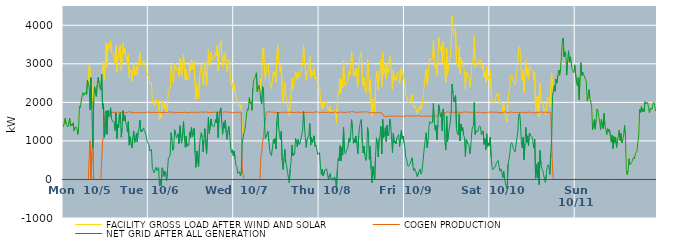
| Category | FACILITY GROSS LOAD AFTER WIND AND SOLAR | COGEN PRODUCTION | NET GRID AFTER ALL GENERATION |
|---|---|---|---|
|  Mon  10/5 | 1365 | 0 | 1365 |
|  Mon  10/5 | 1490 | 0 | 1490 |
|  Mon  10/5 | 1590 | 0 | 1590 |
|  Mon  10/5 | 1428 | 0 | 1428 |
|  Mon  10/5 | 1433 | 0 | 1433 |
|  Mon  10/5 | 1364 | 0 | 1364 |
|  Mon  10/5 | 1379 | 0 | 1379 |
|  Mon  10/5 | 1583 | 0 | 1583 |
|  Mon  10/5 | 1383 | 0 | 1383 |
|  Mon  10/5 | 1437 | 0 | 1437 |
|  Mon  10/5 | 1399 | 0 | 1399 |
|  Mon  10/5 | 1469 | 0 | 1469 |
|  Mon  10/5 | 1269 | 0 | 1269 |
|  Mon  10/5 | 1340 | 0 | 1340 |
|  Mon  10/5 | 1348 | 0 | 1348 |
|  Mon  10/5 | 1351 | 0 | 1351 |
|  Mon  10/5 | 1168 | 0 | 1168 |
|  Mon  10/5 | 1310 | 0 | 1310 |
|  Mon  10/5 | 1898 | 0 | 1898 |
|  Mon  10/5 | 1865 | 0 | 1865 |
|  Mon  10/5 | 2033 | 0 | 2033 |
|  Mon  10/5 | 2163 | 0 | 2163 |
|  Mon  10/5 | 2255 | 0 | 2255 |
|  Mon  10/5 | 2182 | 0 | 2182 |
|  Mon  10/5 | 2204 | 0 | 2204 |
|  Mon  10/5 | 2263 | 0 | 2263 |
|  Mon  10/5 | 2192 | 0 | 2192 |
|  Mon  10/5 | 2575 | 0 | 2575 |
|  Mon  10/5 | 2451 | 0 | 2451 |
|  Mon  10/5 | 2981 | 578 | 2403 |
|  Mon  10/5 | 2805 | 1005 | 1800 |
|  Mon  10/5 | 2639 | 0 | 2639 |
|  Mon  10/5 | 2528 | 690 | 1838 |
|  Mon  10/5 | 1899 | 1086 | 813 |
|  Mon  10/5 | 2031 | 0 | 2031 |
|  Mon  10/5 | 2404 | 0 | 2404 |
|  Mon  10/5 | 2396 | 0 | 2396 |
|  Mon  10/5 | 2156 | 0 | 2156 |
|  Mon  10/5 | 2456 | 0 | 2456 |
|  Mon  10/5 | 2650 | 0 | 2650 |
|  Mon  10/5 | 2511 | 0 | 2511 |
|  Mon  10/5 | 2378 | 0 | 2378 |
|  Mon  10/5 | 2320 | 0 | 2320 |
|  Mon  10/5 | 2735 | 0 | 2735 |
|  Mon  10/5 | 2832 | 989 | 1843 |
|  Mon  10/5 | 3069 | 1104 | 1965 |
|  Mon  10/5 | 2579 | 1488 | 1091 |
|  Mon  10/5 | 3002 | 1735 | 1267 |
|  Mon  10/5 | 3536 | 1754 | 1782 |
|  Mon  10/5 | 2909 | 1738 | 1171 |
|  Mon  10/5 | 3522 | 1730 | 1792 |
|  Mon  10/5 | 3376 | 1752 | 1624 |
|  Mon  10/5 | 3405 | 1743 | 1662 |
|  Mon  10/5 | 3607 | 1745 | 1862 |
|  Mon  10/5 | 3320 | 1741 | 1579 |
|  Mon  10/5 | 3256 | 1740 | 1516 |
|  Mon  10/5 | 3280 | 1743 | 1537 |
|  Mon  10/5 | 3243 | 1739 | 1504 |
|  Mon  10/5 | 3003 | 1735 | 1268 |
|  Mon  10/5 | 3469 | 1742 | 1727 |
|  Mon  10/5 | 2791 | 1731 | 1060 |
|  Mon  10/5 | 3174 | 1746 | 1428 |
|  Mon  10/5 | 3101 | 1752 | 1349 |
|  Mon  10/5 | 3425 | 1736 | 1689 |
|  Mon  10/5 | 3476 | 1745 | 1731 |
|  Mon  10/5 | 2830 | 1737 | 1093 |
|  Mon  10/5 | 3098 | 1751 | 1347 |
|  Mon  10/5 | 3538 | 1750 | 1788 |
|  Mon  10/5 | 3263 | 1740 | 1523 |
|  Mon  10/5 | 3399 | 1735 | 1664 |
|  Mon  10/5 | 3226 | 1742 | 1484 |
|  Mon  10/5 | 3146 | 1726 | 1420 |
|  Mon  10/5 | 2961 | 1735 | 1226 |
|  Mon  10/5 | 3250 | 1750 | 1500 |
|  Mon  10/5 | 2640 | 1750 | 890 |
|  Mon  10/5 | 2866 | 1757 | 1109 |
|  Mon  10/5 | 2833 | 1735 | 1098 |
|  Mon  10/5 | 2546 | 1730 | 816 |
|  Mon  10/5 | 2825 | 1749 | 1076 |
|  Mon  10/5 | 2998 | 1740 | 1258 |
|  Mon  10/5 | 2693 | 1741 | 952 |
|  Mon  10/5 | 2781 | 1731 | 1050 |
|  Mon  10/5 | 2938 | 1748 | 1190 |
|  Mon  10/5 | 2710 | 1736 | 974 |
|  Mon  10/5 | 2979 | 1745 | 1234 |
|  Mon  10/5 | 3075 | 1746 | 1329 |
|  Mon  10/5 | 3293 | 1754 | 1539 |
|  Mon  10/5 | 2963 | 1731 | 1232 |
|  Mon  10/5 | 3038 | 1750 | 1288 |
|  Mon  10/5 | 2984 | 1732 | 1252 |
|  Mon  10/5 | 3079 | 1740 | 1339 |
|  Mon  10/5 | 3006 | 1729 | 1277 |
|  Mon  10/5 | 2991 | 1734 | 1257 |
|  Mon  10/5 | 2894 | 1743 | 1151 |
|  Mon  10/5 | 2731 | 1741 | 990 |
|  Mon  10/5 | 2721 | 1749 | 972 |
|  Tue  10/6 | 2655 | 1754 | 901 |
|  Tue  10/6 | 2488 | 1742 | 746 |
|  Tue  10/6 | 2504 | 1743 | 761 |
|  Tue  10/6 | 2512 | 1735 | 777 |
|  Tue  10/6 | 2019 | 1742 | 277 |
|  Tue  10/6 | 1971 | 1740 | 231 |
|  Tue  10/6 | 1913 | 1742 | 171 |
|  Tue  10/6 | 1982 | 1740 | 242 |
|  Tue  10/6 | 2077 | 1758 | 319 |
|  Tue  10/6 | 1963 | 1732 | 231 |
|  Tue  10/6 | 1964 | 1732 | 232 |
|  Tue  10/6 | 2055 | 1747 | 308 |
|  Tue  10/6 | 1560 | 1729 | -169 |
|  Tue  10/6 | 1742 | 1741 | 1 |
|  Tue  10/6 | 1582 | 1745 | -163 |
|  Tue  10/6 | 2040 | 1737 | 303 |
|  Tue  10/6 | 1988 | 1736 | 252 |
|  Tue  10/6 | 1823 | 1746 | 77 |
|  Tue  10/6 | 1963 | 1751 | 212 |
|  Tue  10/6 | 1874 | 1736 | 138 |
|  Tue  10/6 | 1707 | 1742 | -35 |
|  Tue  10/6 | 1957 | 1739 | 218 |
|  Tue  10/6 | 2289 | 1737 | 552 |
|  Tue  10/6 | 2326 | 1754 | 572 |
|  Tue  10/6 | 2352 | 1734 | 618 |
|  Tue  10/6 | 2954 | 1741 | 1213 |
|  Tue  10/6 | 2784 | 1746 | 1038 |
|  Tue  10/6 | 2504 | 1749 | 755 |
|  Tue  10/6 | 2585 | 1753 | 832 |
|  Tue  10/6 | 3021 | 1732 | 1289 |
|  Tue  10/6 | 2957 | 1754 | 1203 |
|  Tue  10/6 | 2813 | 1737 | 1076 |
|  Tue  10/6 | 2829 | 1757 | 1072 |
|  Tue  10/6 | 2922 | 1736 | 1186 |
|  Tue  10/6 | 2667 | 1737 | 930 |
|  Tue  10/6 | 3136 | 1743 | 1393 |
|  Tue  10/6 | 2836 | 1740 | 1096 |
|  Tue  10/6 | 2675 | 1733 | 942 |
|  Tue  10/6 | 2980 | 1719 | 1261 |
|  Tue  10/6 | 3243 | 1743 | 1500 |
|  Tue  10/6 | 2838 | 1737 | 1101 |
|  Tue  10/6 | 2578 | 1745 | 833 |
|  Tue  10/6 | 2862 | 1739 | 1123 |
|  Tue  10/6 | 2590 | 1732 | 858 |
|  Tue  10/6 | 2653 | 1741 | 912 |
|  Tue  10/6 | 2621 | 1736 | 885 |
|  Tue  10/6 | 2978 | 1750 | 1228 |
|  Tue  10/6 | 2831 | 1744 | 1087 |
|  Tue  10/6 | 3105 | 1745 | 1360 |
|  Tue  10/6 | 2840 | 1737 | 1103 |
|  Tue  10/6 | 2864 | 1750 | 1114 |
|  Tue  10/6 | 3063 | 1741 | 1322 |
|  Tue  10/6 | 2434 | 1745 | 689 |
|  Tue  10/6 | 2065 | 1750 | 315 |
|  Tue  10/6 | 2466 | 1734 | 732 |
|  Tue  10/6 | 2474 | 1734 | 740 |
|  Tue  10/6 | 2085 | 1747 | 338 |
|  Tue  10/6 | 2620 | 1749 | 871 |
|  Tue  10/6 | 2823 | 1741 | 1082 |
|  Tue  10/6 | 2964 | 1752 | 1212 |
|  Tue  10/6 | 2846 | 1744 | 1102 |
|  Tue  10/6 | 2459 | 1742 | 717 |
|  Tue  10/6 | 2778 | 1754 | 1024 |
|  Tue  10/6 | 3060 | 1741 | 1319 |
|  Tue  10/6 | 3059 | 1735 | 1324 |
|  Tue  10/6 | 2426 | 1764 | 662 |
|  Tue  10/6 | 2886 | 1730 | 1156 |
|  Tue  10/6 | 3366 | 1754 | 1612 |
|  Tue  10/6 | 2938 | 1745 | 1193 |
|  Tue  10/6 | 2978 | 1766 | 1212 |
|  Tue  10/6 | 3304 | 1734 | 1570 |
|  Tue  10/6 | 3131 | 1733 | 1398 |
|  Tue  10/6 | 3143 | 1742 | 1401 |
|  Tue  10/6 | 3108 | 1747 | 1361 |
|  Tue  10/6 | 3166 | 1746 | 1420 |
|  Tue  10/6 | 3295 | 1742 | 1553 |
|  Tue  10/6 | 3209 | 1743 | 1466 |
|  Tue  10/6 | 3489 | 1733 | 1756 |
|  Tue  10/6 | 2827 | 1739 | 1088 |
|  Tue  10/6 | 3343 | 1726 | 1617 |
|  Tue  10/6 | 3537 | 1745 | 1792 |
|  Tue  10/6 | 3594 | 1736 | 1858 |
|  Tue  10/6 | 3250 | 1759 | 1491 |
|  Tue  10/6 | 2926 | 1752 | 1174 |
|  Tue  10/6 | 3213 | 1738 | 1475 |
|  Tue  10/6 | 3072 | 1741 | 1331 |
|  Tue  10/6 | 3288 | 1757 | 1531 |
|  Tue  10/6 | 2965 | 1750 | 1215 |
|  Tue  10/6 | 2787 | 1747 | 1040 |
|  Tue  10/6 | 3020 | 1759 | 1261 |
|  Tue  10/6 | 3115 | 1736 | 1379 |
|  Tue  10/6 | 2903 | 1749 | 1154 |
|  Tue  10/6 | 2573 | 1749 | 824 |
|  Tue  10/6 | 2430 | 1729 | 701 |
|  Tue  10/6 | 2497 | 1729 | 768 |
|  Tue  10/6 | 2345 | 1731 | 614 |
|  Wed  10/7 | 2477 | 1740 | 737 |
|  Wed  10/7 | 2272 | 1732 | 540 |
|  Wed  10/7 | 2114 | 1742 | 372 |
|  Wed  10/7 | 2078 | 1746 | 332 |
|  Wed  10/7 | 1900 | 1741 | 159 |
|  Wed  10/7 | 1901 | 1741 | 160 |
|  Wed  10/7 | 1946 | 1741 | 205 |
|  Wed  10/7 | 1840 | 1746 | 94 |
|  Wed  10/7 | 1944 | 1752 | 192 |
|  Wed  10/7 | 1191 | 267 | 924 |
|  Wed  10/7 | 1191 | 267 | 924 |
|  Wed  10/7 | 1211 | 0 | 1211 |
|  Wed  10/7 | 1268 | 0 | 1268 |
|  Wed  10/7 | 1478 | 0 | 1478 |
|  Wed  10/7 | 1711 | 0 | 1711 |
|  Wed  10/7 | 1841 | 0 | 1841 |
|  Wed  10/7 | 1808 | 0 | 1808 |
|  Wed  10/7 | 2123 | 0 | 2123 |
|  Wed  10/7 | 1969 | 0 | 1969 |
|  Wed  10/7 | 2005 | 0 | 2005 |
|  Wed  10/7 | 1792 | 0 | 1792 |
|  Wed  10/7 | 2372 | 0 | 2372 |
|  Wed  10/7 | 2576 | 0 | 2576 |
|  Wed  10/7 | 2617 | 0 | 2617 |
|  Wed  10/7 | 2629 | 0 | 2629 |
|  Wed  10/7 | 2767 | 0 | 2767 |
|  Wed  10/7 | 2274 | 0 | 2274 |
|  Wed  10/7 | 2396 | 0 | 2396 |
|  Wed  10/7 | 2443 | 0 | 2443 |
|  Wed  10/7 | 2291 | 0 | 2291 |
|  Wed  10/7 | 2620 | 590 | 2030 |
|  Wed  10/7 | 2659 | 693 | 1966 |
|  Wed  10/7 | 3381 | 976 | 2405 |
|  Wed  10/7 | 3428 | 1113 | 2315 |
|  Wed  10/7 | 2904 | 1394 | 1510 |
|  Wed  10/7 | 2568 | 1501 | 1067 |
|  Wed  10/7 | 2866 | 1741 | 1125 |
|  Wed  10/7 | 2874 | 1736 | 1138 |
|  Wed  10/7 | 2998 | 1755 | 1243 |
|  Wed  10/7 | 2742 | 1754 | 988 |
|  Wed  10/7 | 2513 | 1753 | 760 |
|  Wed  10/7 | 2404 | 1748 | 656 |
|  Wed  10/7 | 2362 | 1746 | 616 |
|  Wed  10/7 | 2341 | 1744 | 597 |
|  Wed  10/7 | 2781 | 1748 | 1033 |
|  Wed  10/7 | 2695 | 1761 | 934 |
|  Wed  10/7 | 2796 | 1728 | 1068 |
|  Wed  10/7 | 2535 | 1745 | 790 |
|  Wed  10/7 | 3232 | 1740 | 1492 |
|  Wed  10/7 | 3486 | 1739 | 1747 |
|  Wed  10/7 | 3087 | 1734 | 1353 |
|  Wed  10/7 | 2910 | 1745 | 1165 |
|  Wed  10/7 | 2770 | 1739 | 1031 |
|  Wed  10/7 | 2994 | 1743 | 1251 |
|  Wed  10/7 | 2241 | 1744 | 497 |
|  Wed  10/7 | 1998 | 1737 | 261 |
|  Wed  10/7 | 2286 | 1742 | 544 |
|  Wed  10/7 | 2521 | 1738 | 783 |
|  Wed  10/7 | 2186 | 1745 | 441 |
|  Wed  10/7 | 2096 | 1742 | 354 |
|  Wed  10/7 | 1922 | 1738 | 184 |
|  Wed  10/7 | 1924 | 1740 | 184 |
|  Wed  10/7 | 1658 | 1745 | -87 |
|  Wed  10/7 | 2008 | 1742 | 266 |
|  Wed  10/7 | 2216 | 1744 | 472 |
|  Wed  10/7 | 2636 | 1741 | 895 |
|  Wed  10/7 | 2347 | 1736 | 611 |
|  Wed  10/7 | 2414 | 1734 | 680 |
|  Wed  10/7 | 2391 | 1737 | 654 |
|  Wed  10/7 | 2804 | 1742 | 1062 |
|  Wed  10/7 | 2707 | 1741 | 966 |
|  Wed  10/7 | 2589 | 1746 | 843 |
|  Wed  10/7 | 2784 | 1747 | 1037 |
|  Wed  10/7 | 2639 | 1730 | 909 |
|  Wed  10/7 | 2671 | 1735 | 936 |
|  Wed  10/7 | 2781 | 1722 | 1059 |
|  Wed  10/7 | 2895 | 1741 | 1154 |
|  Wed  10/7 | 3011 | 1735 | 1276 |
|  Wed  10/7 | 3497 | 1733 | 1764 |
|  Wed  10/7 | 3125 | 1743 | 1382 |
|  Wed  10/7 | 2828 | 1745 | 1083 |
|  Wed  10/7 | 2577 | 1746 | 831 |
|  Wed  10/7 | 2778 | 1734 | 1044 |
|  Wed  10/7 | 2782 | 1748 | 1034 |
|  Wed  10/7 | 2876 | 1739 | 1137 |
|  Wed  10/7 | 3204 | 1750 | 1454 |
|  Wed  10/7 | 2633 | 1742 | 891 |
|  Wed  10/7 | 2838 | 1745 | 1093 |
|  Wed  10/7 | 2688 | 1731 | 957 |
|  Wed  10/7 | 2718 | 1736 | 982 |
|  Wed  10/7 | 2875 | 1744 | 1131 |
|  Wed  10/7 | 2609 | 1755 | 854 |
|  Wed  10/7 | 2641 | 1755 | 886 |
|  Wed  10/7 | 2604 | 1743 | 861 |
|  Thu  10/8 | 2401 | 1752 | 649 |
|  Thu  10/8 | 2386 | 1746 | 640 |
|  Thu  10/8 | 2426 | 1728 | 698 |
|  Thu  10/8 | 2118 | 1752 | 366 |
|  Thu  10/8 | 1875 | 1742 | 133 |
|  Thu  10/8 | 2011 | 1747 | 264 |
|  Thu  10/8 | 1832 | 1740 | 92 |
|  Thu  10/8 | 1827 | 1729 | 98 |
|  Thu  10/8 | 1989 | 1743 | 246 |
|  Thu  10/8 | 1997 | 1730 | 267 |
|  Thu  10/8 | 2010 | 1736 | 274 |
|  Thu  10/8 | 2009 | 1745 | 264 |
|  Thu  10/8 | 1746 | 1751 | -5 |
|  Thu  10/8 | 1845 | 1743 | 102 |
|  Thu  10/8 | 1887 | 1730 | 157 |
|  Thu  10/8 | 1740 | 1734 | 6 |
|  Thu  10/8 | 1745 | 1740 | 5 |
|  Thu  10/8 | 1768 | 1735 | 33 |
|  Thu  10/8 | 1718 | 1740 | -22 |
|  Thu  10/8 | 1798 | 1730 | 68 |
|  Thu  10/8 | 1743 | 1754 | -11 |
|  Thu  10/8 | 1461 | 1752 | -291 |
|  Thu  10/8 | 1969 | 1725 | 244 |
|  Thu  10/8 | 2279 | 1730 | 549 |
|  Thu  10/8 | 2227 | 1743 | 484 |
|  Thu  10/8 | 2622 | 1746 | 876 |
|  Thu  10/8 | 2231 | 1751 | 480 |
|  Thu  10/8 | 2588 | 1750 | 838 |
|  Thu  10/8 | 2373 | 1743 | 630 |
|  Thu  10/8 | 3097 | 1749 | 1348 |
|  Thu  10/8 | 2472 | 1737 | 735 |
|  Thu  10/8 | 2419 | 1751 | 668 |
|  Thu  10/8 | 2479 | 1744 | 735 |
|  Thu  10/8 | 2487 | 1751 | 736 |
|  Thu  10/8 | 2574 | 1750 | 824 |
|  Thu  10/8 | 2806 | 1741 | 1065 |
|  Thu  10/8 | 2714 | 1745 | 969 |
|  Thu  10/8 | 2907 | 1748 | 1159 |
|  Thu  10/8 | 3316 | 1765 | 1551 |
|  Thu  10/8 | 3066 | 1749 | 1317 |
|  Thu  10/8 | 2695 | 1756 | 939 |
|  Thu  10/8 | 2802 | 1738 | 1064 |
|  Thu  10/8 | 2693 | 1743 | 950 |
|  Thu  10/8 | 2883 | 1754 | 1129 |
|  Thu  10/8 | 2678 | 1744 | 934 |
|  Thu  10/8 | 2396 | 1730 | 666 |
|  Thu  10/8 | 2879 | 1746 | 1133 |
|  Thu  10/8 | 3104 | 1744 | 1360 |
|  Thu  10/8 | 3239 | 1743 | 1496 |
|  Thu  10/8 | 3301 | 1746 | 1555 |
|  Thu  10/8 | 2716 | 1751 | 965 |
|  Thu  10/8 | 2425 | 1739 | 686 |
|  Thu  10/8 | 2624 | 1757 | 867 |
|  Thu  10/8 | 2387 | 1755 | 632 |
|  Thu  10/8 | 2239 | 1744 | 495 |
|  Thu  10/8 | 2373 | 1750 | 623 |
|  Thu  10/8 | 3119 | 1760 | 1359 |
|  Thu  10/8 | 2902 | 1748 | 1154 |
|  Thu  10/8 | 2258 | 1735 | 523 |
|  Thu  10/8 | 2612 | 1750 | 862 |
|  Thu  10/8 | 1999 | 1730 | 269 |
|  Thu  10/8 | 1647 | 1737 | -90 |
|  Thu  10/8 | 2074 | 1740 | 334 |
|  Thu  10/8 | 1879 | 1751 | 128 |
|  Thu  10/8 | 1716 | 1725 | -9 |
|  Thu  10/8 | 2359 | 1742 | 617 |
|  Thu  10/8 | 2815 | 1733 | 1082 |
|  Thu  10/8 | 2645 | 1735 | 910 |
|  Thu  10/8 | 2321 | 1739 | 582 |
|  Thu  10/8 | 2809 | 1754 | 1055 |
|  Thu  10/8 | 2842 | 1727 | 1115 |
|  Thu  10/8 | 3117 | 1741 | 1376 |
|  Thu  10/8 | 2399 | 1735 | 664 |
|  Thu  10/8 | 3300 | 1738 | 1562 |
|  Thu  10/8 | 2726 | 1644 | 1082 |
|  Thu  10/8 | 2832 | 1644 | 1188 |
|  Thu  10/8 | 2978 | 1635 | 1343 |
|  Thu  10/8 | 2612 | 1633 | 979 |
|  Thu  10/8 | 3041 | 1633 | 1408 |
|  Thu  10/8 | 2771 | 1642 | 1129 |
|  Thu  10/8 | 2828 | 1644 | 1184 |
|  Thu  10/8 | 3198 | 1636 | 1562 |
|  Thu  10/8 | 3065 | 1641 | 1424 |
|  Thu  10/8 | 3061 | 1631 | 1430 |
|  Thu  10/8 | 2341 | 1644 | 697 |
|  Thu  10/8 | 2843 | 1643 | 1200 |
|  Thu  10/8 | 2591 | 1642 | 949 |
|  Thu  10/8 | 2657 | 1657 | 1000 |
|  Thu  10/8 | 2560 | 1638 | 922 |
|  Thu  10/8 | 2727 | 1650 | 1077 |
|  Thu  10/8 | 2742 | 1642 | 1100 |
|  Thu  10/8 | 2814 | 1651 | 1163 |
|  Thu  10/8 | 2494 | 1638 | 856 |
|  Thu  10/8 | 2515 | 1638 | 877 |
|  Thu  10/8 | 2906 | 1640 | 1266 |
|  Thu  10/8 | 2685 | 1631 | 1054 |
|  Fri  10/9 | 2748 | 1626 | 1122 |
|  Fri  10/9 | 2601 | 1652 | 949 |
|  Fri  10/9 | 2471 | 1650 | 821 |
|  Fri  10/9 | 2207 | 1640 | 567 |
|  Fri  10/9 | 2165 | 1642 | 523 |
|  Fri  10/9 | 2015 | 1653 | 362 |
|  Fri  10/9 | 1979 | 1643 | 336 |
|  Fri  10/9 | 2016 | 1637 | 379 |
|  Fri  10/9 | 2058 | 1640 | 418 |
|  Fri  10/9 | 2078 | 1657 | 421 |
|  Fri  10/9 | 2200 | 1637 | 563 |
|  Fri  10/9 | 2000 | 1644 | 356 |
|  Fri  10/9 | 1869 | 1643 | 226 |
|  Fri  10/9 | 1931 | 1648 | 283 |
|  Fri  10/9 | 1868 | 1639 | 229 |
|  Fri  10/9 | 1887 | 1645 | 242 |
|  Fri  10/9 | 1704 | 1638 | 66 |
|  Fri  10/9 | 1812 | 1651 | 161 |
|  Fri  10/9 | 1809 | 1650 | 159 |
|  Fri  10/9 | 1926 | 1652 | 274 |
|  Fri  10/9 | 1804 | 1666 | 138 |
|  Fri  10/9 | 1804 | 1624 | 180 |
|  Fri  10/9 | 2025 | 1636 | 389 |
|  Fri  10/9 | 2285 | 1650 | 635 |
|  Fri  10/9 | 2290 | 1645 | 645 |
|  Fri  10/9 | 2707 | 1642 | 1065 |
|  Fri  10/9 | 2856 | 1645 | 1211 |
|  Fri  10/9 | 2469 | 1643 | 826 |
|  Fri  10/9 | 2624 | 1648 | 976 |
|  Fri  10/9 | 3020 | 1644 | 1376 |
|  Fri  10/9 | 3151 | 1650 | 1501 |
|  Fri  10/9 | 3107 | 1642 | 1465 |
|  Fri  10/9 | 3098 | 1642 | 1456 |
|  Fri  10/9 | 3121 | 1648 | 1473 |
|  Fri  10/9 | 3609 | 1635 | 1974 |
|  Fri  10/9 | 3142 | 1641 | 1501 |
|  Fri  10/9 | 2920 | 1641 | 1279 |
|  Fri  10/9 | 3034 | 1635 | 1399 |
|  Fri  10/9 | 2687 | 1658 | 1029 |
|  Fri  10/9 | 3069 | 1653 | 1416 |
|  Fri  10/9 | 3694 | 1755 | 1939 |
|  Fri  10/9 | 3528 | 1720 | 1808 |
|  Fri  10/9 | 3347 | 1727 | 1620 |
|  Fri  10/9 | 3451 | 1739 | 1712 |
|  Fri  10/9 | 3012 | 1752 | 1260 |
|  Fri  10/9 | 3570 | 1740 | 1830 |
|  Fri  10/9 | 3398 | 1752 | 1646 |
|  Fri  10/9 | 2711 | 1729 | 982 |
|  Fri  10/9 | 2515 | 1752 | 763 |
|  Fri  10/9 | 3395 | 1754 | 1641 |
|  Fri  10/9 | 2720 | 1736 | 984 |
|  Fri  10/9 | 2940 | 1746 | 1194 |
|  Fri  10/9 | 3076 | 1741 | 1335 |
|  Fri  10/9 | 3203 | 1734 | 1469 |
|  Fri  10/9 | 3497 | 1744 | 1753 |
|  Fri  10/9 | 4236 | 1760 | 2476 |
|  Fri  10/9 | 3991 | 1747 | 2244 |
|  Fri  10/9 | 3732 | 1729 | 2003 |
|  Fri  10/9 | 3769 | 1746 | 2023 |
|  Fri  10/9 | 3927 | 1741 | 2186 |
|  Fri  10/9 | 3071 | 1745 | 1326 |
|  Fri  10/9 | 2939 | 1745 | 1194 |
|  Fri  10/9 | 2897 | 1745 | 1152 |
|  Fri  10/9 | 3447 | 1743 | 1704 |
|  Fri  10/9 | 2734 | 1733 | 1001 |
|  Fri  10/9 | 3174 | 1734 | 1440 |
|  Fri  10/9 | 3023 | 1754 | 1269 |
|  Fri  10/9 | 3073 | 1728 | 1345 |
|  Fri  10/9 | 2899 | 1757 | 1142 |
|  Fri  10/9 | 2846 | 1749 | 1097 |
|  Fri  10/9 | 2338 | 1746 | 592 |
|  Fri  10/9 | 2781 | 1741 | 1040 |
|  Fri  10/9 | 2794 | 1746 | 1048 |
|  Fri  10/9 | 2672 | 1749 | 923 |
|  Fri  10/9 | 2639 | 1750 | 889 |
|  Fri  10/9 | 2409 | 1743 | 666 |
|  Fri  10/9 | 2579 | 1741 | 838 |
|  Fri  10/9 | 2925 | 1733 | 1192 |
|  Fri  10/9 | 3101 | 1736 | 1365 |
|  Fri  10/9 | 3154 | 1763 | 1391 |
|  Fri  10/9 | 3740 | 1745 | 1995 |
|  Fri  10/9 | 2915 | 1746 | 1169 |
|  Fri  10/9 | 2988 | 1736 | 1252 |
|  Fri  10/9 | 3010 | 1734 | 1276 |
|  Fri  10/9 | 2976 | 1735 | 1241 |
|  Fri  10/9 | 3095 | 1739 | 1356 |
|  Fri  10/9 | 3117 | 1726 | 1391 |
|  Fri  10/9 | 3106 | 1749 | 1357 |
|  Fri  10/9 | 2900 | 1740 | 1160 |
|  Fri  10/9 | 2873 | 1727 | 1146 |
|  Fri  10/9 | 2986 | 1725 | 1261 |
|  Fri  10/9 | 2648 | 1738 | 910 |
|  Fri  10/9 | 2799 | 1736 | 1063 |
|  Fri  10/9 | 2518 | 1739 | 779 |
|  Fri  10/9 | 2930 | 1744 | 1186 |
|  Fri  10/9 | 2579 | 1735 | 844 |
|  Sat  10/10 | 2685 | 1737 | 948 |
|  Sat  10/10 | 2630 | 1753 | 877 |
|  Sat  10/10 | 2848 | 1746 | 1102 |
|  Sat  10/10 | 2312 | 1740 | 572 |
|  Sat  10/10 | 2090 | 1753 | 337 |
|  Sat  10/10 | 2004 | 1752 | 252 |
|  Sat  10/10 | 2029 | 1750 | 279 |
|  Sat  10/10 | 2012 | 1737 | 275 |
|  Sat  10/10 | 2087 | 1738 | 349 |
|  Sat  10/10 | 2206 | 1755 | 451 |
|  Sat  10/10 | 2167 | 1728 | 439 |
|  Sat  10/10 | 2234 | 1742 | 492 |
|  Sat  10/10 | 2041 | 1736 | 305 |
|  Sat  10/10 | 1951 | 1735 | 216 |
|  Sat  10/10 | 2016 | 1739 | 277 |
|  Sat  10/10 | 1923 | 1746 | 177 |
|  Sat  10/10 | 1771 | 1731 | 40 |
|  Sat  10/10 | 1961 | 1743 | 218 |
|  Sat  10/10 | 1798 | 1755 | 43 |
|  Sat  10/10 | 1629 | 1736 | -107 |
|  Sat  10/10 | 1622 | 1740 | -118 |
|  Sat  10/10 | 1491 | 1746 | -255 |
|  Sat  10/10 | 2137 | 1734 | 403 |
|  Sat  10/10 | 2249 | 1747 | 502 |
|  Sat  10/10 | 2417 | 1738 | 679 |
|  Sat  10/10 | 2660 | 1753 | 907 |
|  Sat  10/10 | 2710 | 1753 | 957 |
|  Sat  10/10 | 2638 | 1741 | 897 |
|  Sat  10/10 | 2533 | 1736 | 797 |
|  Sat  10/10 | 2518 | 1746 | 772 |
|  Sat  10/10 | 2457 | 1741 | 716 |
|  Sat  10/10 | 2473 | 1741 | 732 |
|  Sat  10/10 | 2828 | 1737 | 1091 |
|  Sat  10/10 | 3018 | 1762 | 1256 |
|  Sat  10/10 | 3397 | 1736 | 1661 |
|  Sat  10/10 | 3443 | 1732 | 1711 |
|  Sat  10/10 | 3201 | 1733 | 1468 |
|  Sat  10/10 | 2673 | 1727 | 946 |
|  Sat  10/10 | 2568 | 1750 | 818 |
|  Sat  10/10 | 2848 | 1750 | 1098 |
|  Sat  10/10 | 2250 | 1735 | 515 |
|  Sat  10/10 | 2680 | 1746 | 934 |
|  Sat  10/10 | 3090 | 1739 | 1351 |
|  Sat  10/10 | 2688 | 1732 | 956 |
|  Sat  10/10 | 2872 | 1740 | 1132 |
|  Sat  10/10 | 2619 | 1744 | 875 |
|  Sat  10/10 | 2955 | 1750 | 1205 |
|  Sat  10/10 | 2894 | 1744 | 1150 |
|  Sat  10/10 | 2883 | 1733 | 1150 |
|  Sat  10/10 | 2855 | 1742 | 1113 |
|  Sat  10/10 | 2829 | 1737 | 1092 |
|  Sat  10/10 | 2553 | 1735 | 818 |
|  Sat  10/10 | 2769 | 1721 | 1048 |
|  Sat  10/10 | 1770 | 1739 | 31 |
|  Sat  10/10 | 2125 | 1736 | 389 |
|  Sat  10/10 | 1791 | 1746 | 45 |
|  Sat  10/10 | 2185 | 1737 | 448 |
|  Sat  10/10 | 1622 | 1753 | -131 |
|  Sat  10/10 | 2497 | 1746 | 751 |
|  Sat  10/10 | 2140 | 1755 | 385 |
|  Sat  10/10 | 2043 | 1753 | 290 |
|  Sat  10/10 | 1985 | 1752 | 233 |
|  Sat  10/10 | 1849 | 1730 | 119 |
|  Sat  10/10 | 1858 | 1749 | 109 |
|  Sat  10/10 | 1677 | 1753 | -76 |
|  Sat  10/10 | 1854 | 1746 | 108 |
|  Sat  10/10 | 2070 | 1732 | 338 |
|  Sat  10/10 | 2125 | 1747 | 378 |
|  Sat  10/10 | 2080 | 1747 | 333 |
|  Sat  10/10 | 1885 | 1753 | 132 |
|  Sat  10/10 | 2398 | 1741 | 657 |
|  Sat  10/10 | 2764 | 1756 | 1008 |
|  Sat  10/10 | 2423 | 262 | 2161 |
|  Sat  10/10 | 2285 | 0 | 2285 |
|  Sat  10/10 | 2440 | 0 | 2440 |
|  Sat  10/10 | 2287 | 0 | 2287 |
|  Sat  10/10 | 2601 | 0 | 2601 |
|  Sat  10/10 | 2498 | 0 | 2498 |
|  Sat  10/10 | 2708 | 0 | 2708 |
|  Sat  10/10 | 2838 | 0 | 2838 |
|  Sat  10/10 | 2702 | 0 | 2702 |
|  Sat  10/10 | 2879 | 0 | 2879 |
|  Sat  10/10 | 3194 | 0 | 3194 |
|  Sat  10/10 | 3585 | 0 | 3585 |
|  Sat  10/10 | 3669 | 0 | 3669 |
|  Sat  10/10 | 3177 | 0 | 3177 |
|  Sat  10/10 | 3313 | 0 | 3313 |
|  Sat  10/10 | 3212 | 0 | 3212 |
|  Sat  10/10 | 2708 | 0 | 2708 |
|  Sat  10/10 | 3093 | 0 | 3093 |
|  Sat  10/10 | 3342 | 0 | 3342 |
|  Sat  10/10 | 3038 | 0 | 3038 |
|  Sat  10/10 | 3182 | 0 | 3182 |
|  Sat  10/10 | 3035 | 0 | 3035 |
|  Sat  10/10 | 2856 | 0 | 2856 |
|  Sat  10/10 | 2880 | 0 | 2880 |
|  Sun  10/11 | 2768 | 0 | 2768 |
|  Sun  10/11 | 2972 | 0 | 2972 |
|  Sun  10/11 | 2997 | 0 | 2997 |
|  Sun  10/11 | 2521 | 0 | 2521 |
|  Sun  10/11 | 2430 | 0 | 2430 |
|  Sun  10/11 | 2639 | 0 | 2639 |
|  Sun  10/11 | 2075 | 0 | 2075 |
|  Sun  10/11 | 2658 | 0 | 2658 |
|  Sun  10/11 | 3030 | 0 | 3030 |
|  Sun  10/11 | 2689 | 0 | 2689 |
|  Sun  10/11 | 2787 | 0 | 2787 |
|  Sun  10/11 | 2725 | 0 | 2725 |
|  Sun  10/11 | 2748 | 0 | 2748 |
|  Sun  10/11 | 2603 | 0 | 2603 |
|  Sun  10/11 | 2529 | 0 | 2529 |
|  Sun  10/11 | 2033 | 0 | 2033 |
|  Sun  10/11 | 2147 | 0 | 2147 |
|  Sun  10/11 | 2331 | 0 | 2331 |
|  Sun  10/11 | 2099 | 0 | 2099 |
|  Sun  10/11 | 2005 | 0 | 2005 |
|  Sun  10/11 | 1914 | 0 | 1914 |
|  Sun  10/11 | 1290 | 0 | 1290 |
|  Sun  10/11 | 1439 | 0 | 1439 |
|  Sun  10/11 | 1557 | 0 | 1557 |
|  Sun  10/11 | 1303 | 0 | 1303 |
|  Sun  10/11 | 1545 | 0 | 1545 |
|  Sun  10/11 | 1830 | 0 | 1830 |
|  Sun  10/11 | 1781 | 0 | 1781 |
|  Sun  10/11 | 1634 | 0 | 1634 |
|  Sun  10/11 | 1511 | 0 | 1511 |
|  Sun  10/11 | 1288 | 0 | 1288 |
|  Sun  10/11 | 1558 | 0 | 1558 |
|  Sun  10/11 | 1557 | 0 | 1557 |
|  Sun  10/11 | 1320 | 0 | 1320 |
|  Sun  10/11 | 1712 | 0 | 1712 |
|  Sun  10/11 | 1399 | 0 | 1399 |
|  Sun  10/11 | 1404 | 0 | 1404 |
|  Sun  10/11 | 1165 | 0 | 1165 |
|  Sun  10/11 | 1318 | 0 | 1318 |
|  Sun  10/11 | 1246 | 0 | 1246 |
|  Sun  10/11 | 1304 | 0 | 1304 |
|  Sun  10/11 | 1130 | 0 | 1130 |
|  Sun  10/11 | 967 | 0 | 967 |
|  Sun  10/11 | 1152 | 0 | 1152 |
|  Sun  10/11 | 799 | 0 | 799 |
|  Sun  10/11 | 1117 | 0 | 1117 |
|  Sun  10/11 | 942 | 0 | 942 |
|  Sun  10/11 | 1101 | 0 | 1101 |
|  Sun  10/11 | 829 | 0 | 829 |
|  Sun  10/11 | 981 | 0 | 981 |
|  Sun  10/11 | 986 | 0 | 986 |
|  Sun  10/11 | 1278 | 0 | 1278 |
|  Sun  10/11 | 1015 | 0 | 1015 |
|  Sun  10/11 | 1194 | 0 | 1194 |
|  Sun  10/11 | 950 | 0 | 950 |
|  Sun  10/11 | 1009 | 0 | 1009 |
|  Sun  10/11 | 1168 | 0 | 1168 |
|  Sun  10/11 | 1413 | 0 | 1413 |
|  Sun  10/11 | 1123 | 0 | 1123 |
|  Sun  10/11 | 227 | 0 | 227 |
|  Sun  10/11 | 125 | 0 | 125 |
|  Sun  10/11 | 228 | 0 | 228 |
|  Sun  10/11 | 540 | 0 | 540 |
|  Sun  10/11 | 383 | 0 | 383 |
|  Sun  10/11 | 358 | 0 | 358 |
|  Sun  10/11 | 437 | 0 | 437 |
|  Sun  10/11 | 502 | 0 | 502 |
|  Sun  10/11 | 567 | 0 | 567 |
|  Sun  10/11 | 534 | 0 | 534 |
|  Sun  10/11 | 661 | 0 | 661 |
|  Sun  10/11 | 695 | 0 | 695 |
|  Sun  10/11 | 740 | 0 | 740 |
|  Sun  10/11 | 958 | 0 | 958 |
|  Sun  10/11 | 1155 | 0 | 1155 |
|  Sun  10/11 | 1820 | 0 | 1820 |
|  Sun  10/11 | 1740 | 0 | 1740 |
|  Sun  10/11 | 1895 | 0 | 1895 |
|  Sun  10/11 | 1753 | 0 | 1753 |
|  Sun  10/11 | 1835 | 0 | 1835 |
|  Sun  10/11 | 1756 | 0 | 1756 |
|  Sun  10/11 | 2016 | 0 | 2016 |
|  Sun  10/11 | 1961 | 0 | 1961 |
|  Sun  10/11 | 1963 | 0 | 1963 |
|  Sun  10/11 | 2001 | 0 | 2001 |
|  Sun  10/11 | 1851 | 0 | 1851 |
|  Sun  10/11 | 1730 | 0 | 1730 |
|  Sun  10/11 | 1851 | 0 | 1851 |
|  Sun  10/11 | 1849 | 0 | 1849 |
|  Sun  10/11 | 1816 | 0 | 1816 |
|  Sun  10/11 | 1979 | 0 | 1979 |
|  Sun  10/11 | 2006 | 0 | 2006 |
|  Sun  10/11 | 1896 | 0 | 1896 |
|  Sun  10/11 | 1771 | 0 | 1771 |
|  Sun  10/11 | 1788 | 0 | 1788 |